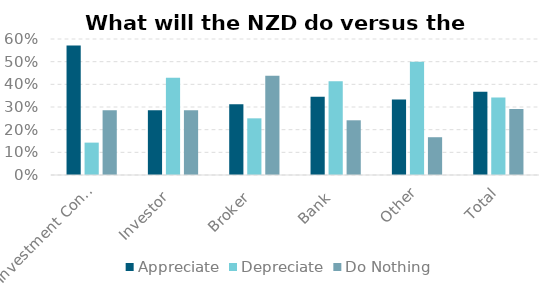
| Category | Appreciate | Depreciate | Do Nothing |
|---|---|---|---|
| Investment Consultant | 0.571 | 0.143 | 0.286 |
| Investor | 0.286 | 0.429 | 0.286 |
| Broker | 0.312 | 0.25 | 0.438 |
| Bank | 0.345 | 0.414 | 0.241 |
| Other | 0.333 | 0.5 | 0.167 |
| Total | 0.367 | 0.342 | 0.291 |